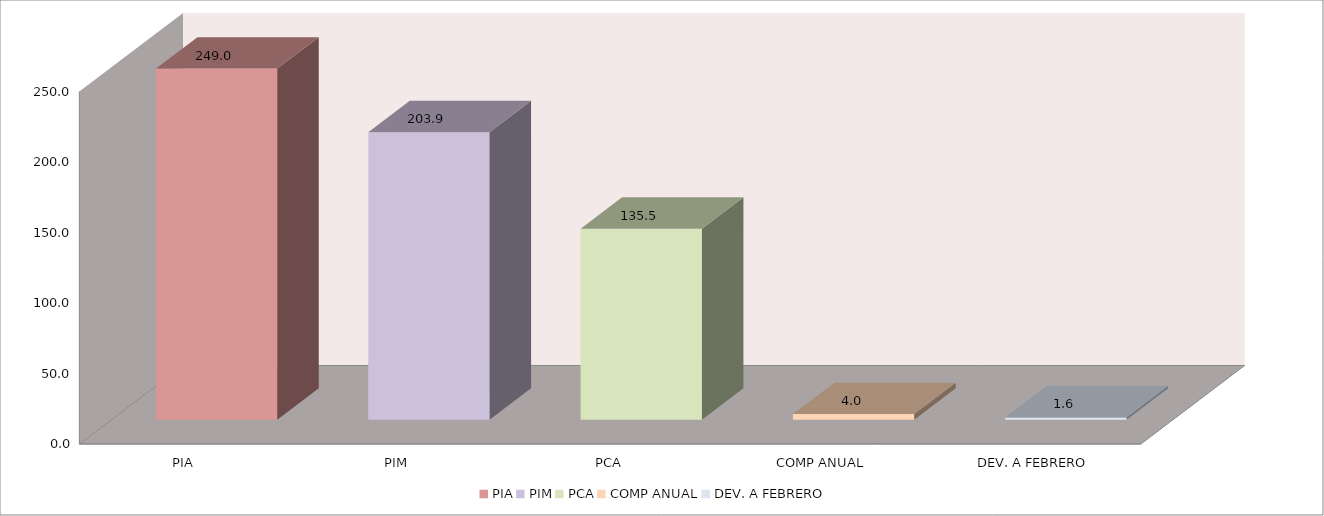
| Category | 011 MINISTERIO DE SALUD |
|---|---|
| PIA | 249.028 |
| PIM | 203.887 |
| PCA | 135.45 |
| COMP ANUAL | 3.966 |
| DEV. A FEBRERO | 1.631 |